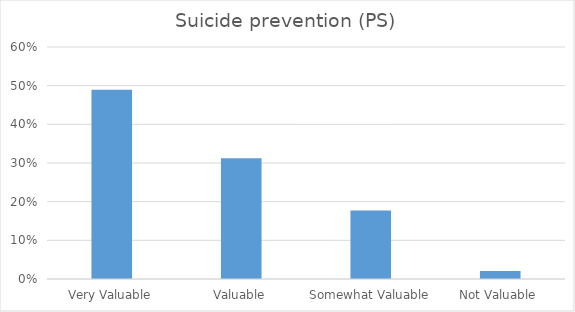
| Category | Suicide prevention (PS) |
|---|---|
| Very Valuable | 0.49 |
| Valuable | 0.312 |
| Somewhat Valuable | 0.177 |
| Not Valuable | 0.021 |